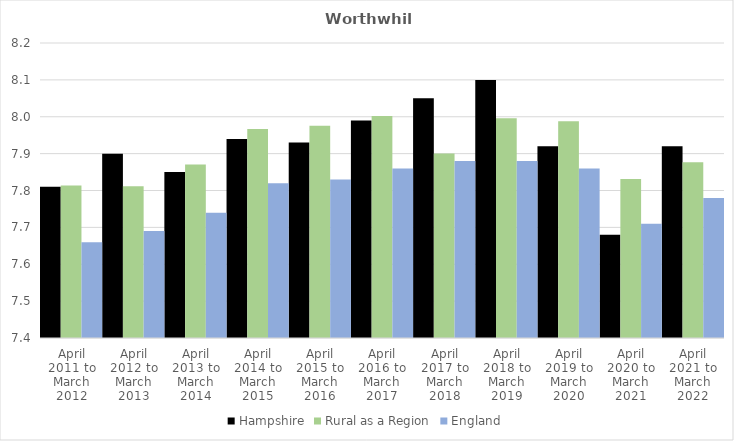
| Category | Hampshire | Rural as a Region | England |
|---|---|---|---|
| April 2011 to March 2012 | 7.81 | 7.813 | 7.66 |
| April 2012 to March 2013 | 7.9 | 7.811 | 7.69 |
| April 2013 to March 2014 | 7.85 | 7.871 | 7.74 |
| April 2014 to March 2015 | 7.94 | 7.967 | 7.82 |
| April 2015 to March 2016 | 7.93 | 7.975 | 7.83 |
| April 2016 to March 2017 | 7.99 | 8.002 | 7.86 |
| April 2017 to March 2018 | 8.05 | 7.9 | 7.88 |
| April 2018 to March 2019 | 8.1 | 7.996 | 7.88 |
| April 2019 to March 2020 | 7.92 | 7.988 | 7.86 |
| April 2020 to March 2021 | 7.68 | 7.831 | 7.71 |
| April 2021 to March 2022 | 7.92 | 7.877 | 7.78 |